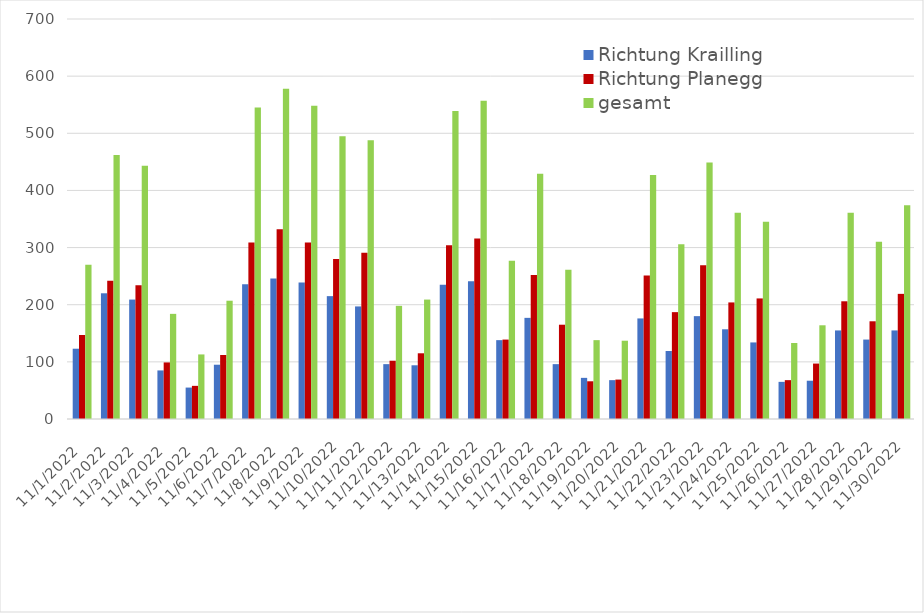
| Category | Richtung Krailling  | Richtung Planegg | gesamt |
|---|---|---|---|
| 01.11.2022 | 123 | 147 | 270 |
| 02.11.2022 | 220 | 242 | 462 |
| 03.11.2022 | 209 | 234 | 443 |
| 04.11.2022 | 85 | 99 | 184 |
| 05.11.2022 | 55 | 58 | 113 |
| 06.11.2022 | 95 | 112 | 207 |
| 07.11.2022 | 236 | 309 | 545 |
| 08.11.2022 | 246 | 332 | 578 |
| 09.11.2022 | 239 | 309 | 548 |
| 10.11.2022 | 215 | 280 | 495 |
| 11.11.2022 | 197 | 291 | 488 |
| 12.11.2022 | 96 | 102 | 198 |
| 13.11.2022 | 94 | 115 | 209 |
| 14.11.2022 | 235 | 304 | 539 |
| 15.11.2022 | 241 | 316 | 557 |
| 16.11.2022 | 138 | 139 | 277 |
| 17.11.2022 | 177 | 252 | 429 |
| 18.11.2022 | 96 | 165 | 261 |
| 19.11.2022 | 72 | 66 | 138 |
| 20.11.2022 | 68 | 69 | 137 |
| 21.11.2022 | 176 | 251 | 427 |
| 22.11.2022 | 119 | 187 | 306 |
| 23.11.2022 | 180 | 269 | 449 |
| 24.11.2022 | 157 | 204 | 361 |
| 25.11.2022 | 134 | 211 | 345 |
| 26.11.2022 | 65 | 68 | 133 |
| 27.11.2022 | 67 | 97 | 164 |
| 28.11.2022 | 155 | 206 | 361 |
| 29.11.2022 | 139 | 171 | 310 |
| 30.11.2022 | 155 | 219 | 374 |